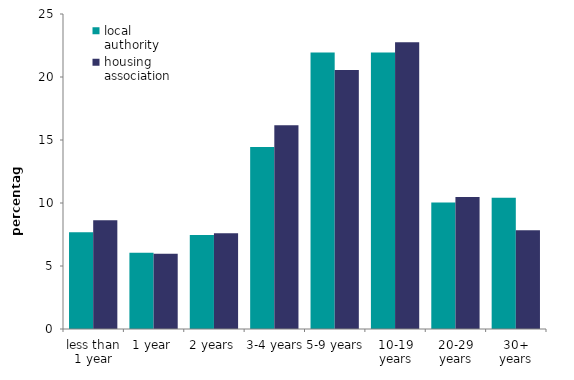
| Category | local authority | housing association |
|---|---|---|
| less than 1 year | 7.681 | 8.628 |
| 1 year | 6.045 | 5.975 |
| 2 years | 7.461 | 7.592 |
| 3-4 years | 14.453 | 16.163 |
| 5-9 years | 21.939 | 20.565 |
| 10-19 years | 21.953 | 22.763 |
| 20-29 years | 10.048 | 10.471 |
| 30+ years | 10.418 | 7.842 |